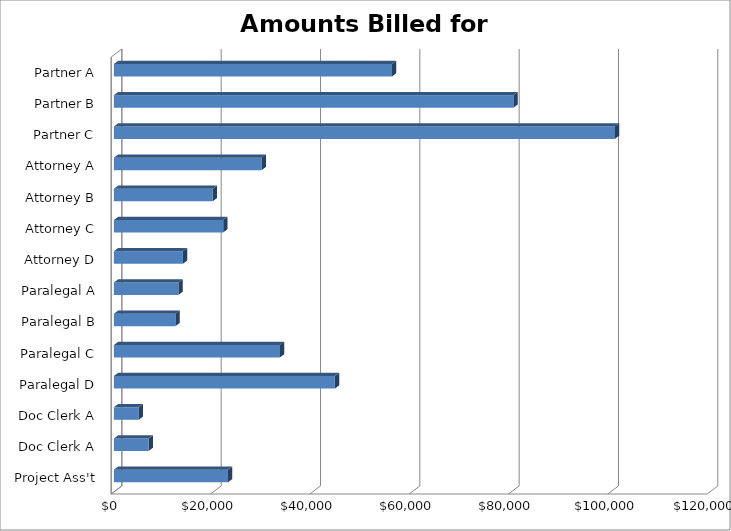
| Category | Total |
|---|---|
| Partner A | 56000 |
| Partner B | 80456 |
| Partner C | 100876 |
| Attorney A | 29765 |
| Attorney B | 19897 |
| Attorney C | 22000 |
| Attorney D | 13908 |
| Paralegal A | 12999 |
| Paralegal B | 12400 |
| Paralegal C | 33456 |
| Paralegal D | 44500 |
| Doc Clerk A | 5000 |
| Doc Clerk A | 7000 |
| Project Ass't | 23000 |